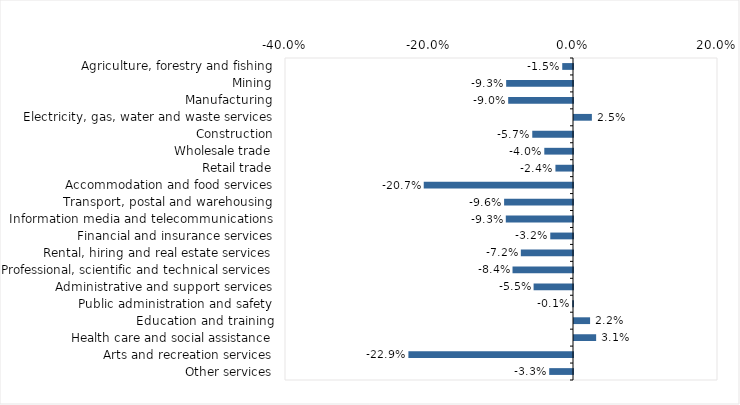
| Category | This week |
|---|---|
| Agriculture, forestry and fishing | -0.015 |
| Mining | -0.093 |
| Manufacturing | -0.09 |
| Electricity, gas, water and waste services | 0.025 |
| Construction | -0.057 |
| Wholesale trade | -0.04 |
| Retail trade | -0.024 |
| Accommodation and food services | -0.207 |
| Transport, postal and warehousing | -0.096 |
| Information media and telecommunications | -0.093 |
| Financial and insurance services | -0.032 |
| Rental, hiring and real estate services | -0.072 |
| Professional, scientific and technical services | -0.084 |
| Administrative and support services | -0.055 |
| Public administration and safety | -0.001 |
| Education and training | 0.022 |
| Health care and social assistance | 0.031 |
| Arts and recreation services | -0.229 |
| Other services | -0.033 |